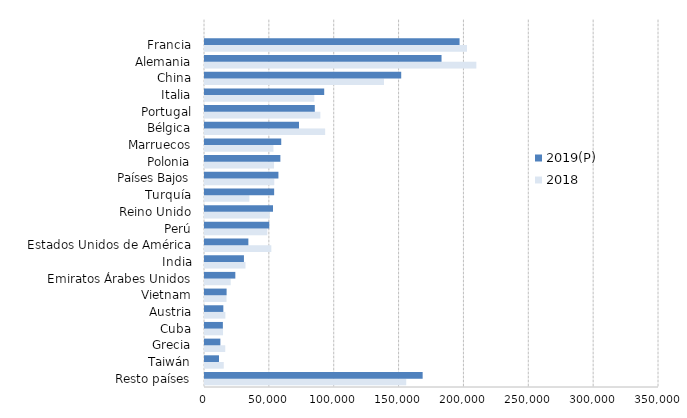
| Category | 2018 | 2019(P) |
|---|---|---|
| Resto países | 155128.991 | 167790.592 |
| Taiwán | 14447.221 | 10775.083 |
| Grecia | 15616.407 | 11849.601 |
| Cuba | 13901.339 | 13777.321 |
| Austria | 15706.022 | 14136.389 |
| Vietnam | 16582.83 | 16654.185 |
| Emiratos Árabes Unidos | 19810.962 | 23379.074 |
| India | 31195.778 | 30012.195 |
| Estados Unidos de América | 51125.296 | 33430.881 |
| Perú | 48045.192 | 49525.521 |
| Reino Unido | 49853.368 | 52427.062 |
| Turquía | 34201.715 | 53311.999 |
| Países Bajos | 53402.685 | 56606.505 |
| Polonia | 53241.08 | 58106.238 |
| Marruecos | 52770.737 | 58775.635 |
| Bélgica | 92622.869 | 72464.288 |
| Portugal | 88930.534 | 84642.674 |
| Italia | 84303.732 | 91898.862 |
| China | 137989.716 | 151267.734 |
| Alemania | 209195.464 | 182349.499 |
| Francia | 201974.978 | 196255.699 |